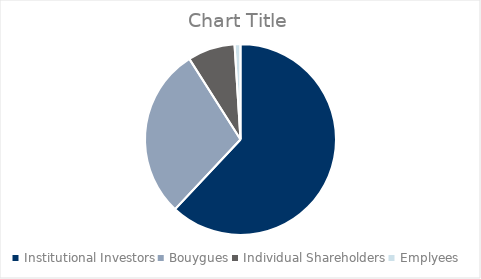
| Category | Series 0 |
|---|---|
| Institutional Investors | 62 |
| Bouygues | 29 |
| Individual Shareholders | 8 |
| Emplyees | 1 |